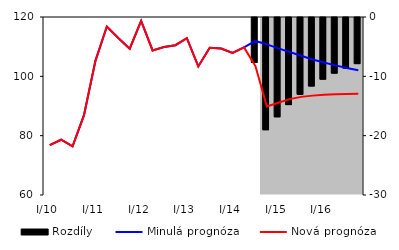
| Category | Rozdíly |
|---|---|
| 0 | 0 |
| 1 | 0 |
| 2 | 0 |
| 3 | 0 |
| 4 | 0 |
| 5 | 0 |
| 6 | 0 |
| 7 | 0 |
| 8 | 0 |
| 9 | 0 |
| 10 | 0 |
| 11 | 0 |
| 12 | 0 |
| 13 | 0 |
| 14 | 0 |
| 15 | 0 |
| 16 | 0 |
| 17 | 0 |
| 18 | -7.571 |
| 19 | -18.914 |
| 20 | -16.735 |
| 21 | -14.676 |
| 22 | -12.946 |
| 23 | -11.546 |
| 24 | -10.398 |
| 25 | -9.375 |
| 26 | -8.52 |
| 27 | -7.772 |